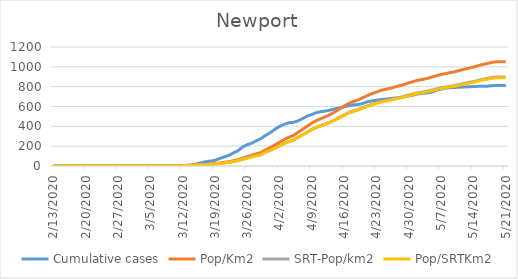
| Category | Cumulative cases | Pop/Km2 | SRT-Pop/km2 | Pop/SRTKm2 |
|---|---|---|---|---|
| 5/21/20 | 812 | 1051.296 | 897.581 | 889.834 |
| 5/20/20 | 812 | 1051.296 | 897.581 | 889.834 |
| 5/19/20 | 812 | 1051.049 | 897.37 | 889.625 |
| 5/18/20 | 810 | 1045.287 | 892.45 | 884.747 |
| 5/17/20 | 805 | 1033.022 | 881.978 | 874.366 |
| 5/16/20 | 805 | 1023.884 | 874.176 | 866.632 |
| 5/15/20 | 803 | 1011.042 | 863.212 | 855.762 |
| 5/14/20 | 801 | 996.801 | 851.053 | 843.708 |
| 5/13/20 | 799 | 986.923 | 842.619 | 835.347 |
| 5/12/20 | 796 | 975.563 | 832.92 | 825.732 |
| 5/11/20 | 795 | 964.285 | 823.292 | 816.186 |
| 5/10/20 | 792 | 950.291 | 811.344 | 804.341 |
| 5/9/20 | 790 | 942.141 | 804.386 | 797.443 |
| 5/8/20 | 785 | 931.934 | 795.671 | 788.803 |
| 5/7/20 | 775 | 923.702 | 788.642 | 781.836 |
| 5/6/20 | 764 | 910.119 | 777.046 | 770.339 |
| 5/5/20 | 745 | 896.537 | 765.449 | 758.843 |
| 5/4/20 | 738 | 883.448 | 754.274 | 747.764 |
| 5/3/20 | 732 | 872.911 | 745.278 | 738.846 |
| 5/2/20 | 727 | 865.173 | 738.671 | 732.296 |
| 5/1/20 | 715 | 851.426 | 726.934 | 720.66 |
| 4/30/20 | 707 | 838.419 | 715.829 | 709.651 |
| 4/29/20 | 696 | 822.614 | 702.335 | 696.274 |
| 4/28/20 | 688 | 809.196 | 690.879 | 684.916 |
| 4/27/20 | 685 | 797.178 | 680.618 | 674.744 |
| 4/26/20 | 680 | 783.677 | 669.091 | 663.317 |
| 4/25/20 | 674 | 773.881 | 660.728 | 655.025 |
| 4/24/20 | 670 | 762.768 | 651.24 | 645.619 |
| 4/23/20 | 663 | 745.728 | 636.691 | 631.196 |
| 4/22/20 | 657 | 729.429 | 622.775 | 617.4 |
| 4/21/20 | 647 | 708.767 | 605.134 | 599.911 |
| 4/20/20 | 630 | 687.94 | 587.353 | 582.283 |
| 4/19/20 | 620 | 665.302 | 568.025 | 563.122 |
| 4/18/20 | 616 | 650.65 | 555.515 | 550.72 |
| 4/17/20 | 607 | 630.646 | 538.436 | 533.789 |
| 4/16/20 | 597 | 604.139 | 515.805 | 511.353 |
| 4/15/20 | 586 | 574.587 | 490.573 | 486.339 |
| 4/14/20 | 577 | 545.364 | 465.623 | 461.604 |
| 4/13/20 | 564 | 519.845 | 443.835 | 440.005 |
| 4/12/20 | 555 | 497.866 | 425.07 | 421.401 |
| 4/11/20 | 548 | 477.862 | 407.991 | 404.47 |
| 4/10/20 | 538 | 457.776 | 390.842 | 387.469 |
| 4/9/20 | 520 | 433.08 | 369.757 | 366.566 |
| 4/8/20 | 503 | 400.976 | 342.347 | 339.392 |
| 4/7/20 | 478 | 369.448 | 315.429 | 312.706 |
| 4/6/20 | 455 | 338.496 | 289.003 | 286.508 |
| 4/5/20 | 440 | 307.297 | 262.365 | 260.101 |
| 4/4/20 | 436 | 289.104 | 246.833 | 244.703 |
| 4/3/20 | 420 | 265.973 | 227.083 | 225.124 |
| 4/2/20 | 398 | 239.301 | 204.312 | 202.548 |
| 4/1/20 | 370 | 211.889 | 180.908 | 179.346 |
| 3/31/20 | 336 | 185.547 | 158.417 | 157.05 |
| 3/30/20 | 309 | 163.239 | 139.371 | 138.168 |
| 3/29/20 | 277 | 135.744 | 115.896 | 114.896 |
| 3/28/20 | 255 | 122.902 | 104.932 | 104.026 |
| 3/27/20 | 230 | 109.237 | 93.265 | 92.46 |
| 3/26/20 | 215 | 94.008 | 80.263 | 79.57 |
| 3/25/20 | 191 | 79.685 | 68.034 | 67.446 |
| 3/24/20 | 154 | 64.62 | 55.172 | 54.696 |
| 3/23/20 | 132 | 53.507 | 45.684 | 45.289 |
| 3/22/20 | 106 | 42.806 | 36.547 | 36.232 |
| 3/21/20 | 91 | 36.55 | 31.206 | 30.936 |
| 3/20/20 | 75 | 30.376 | 25.934 | 25.71 |
| 3/19/20 | 57 | 24.449 | 20.874 | 20.694 |
| 3/18/20 | 49 | 19.51 | 16.657 | 16.513 |
| 3/17/20 | 43 | 16.628 | 14.197 | 14.075 |
| 3/16/20 | 32 | 13.583 | 11.597 | 11.497 |
| 3/15/20 | 21 | 10.784 | 9.207 | 9.128 |
| 3/14/20 | 9 | 8.397 | 7.169 | 7.107 |
| 3/13/20 | 5 | 6.832 | 5.833 | 5.783 |
| 3/12/20 | 1 | 4.61 | 3.936 | 3.902 |
| 3/11/20 | 1 | 2.634 | 2.249 | 2.23 |
| 3/10/20 | 0 | 1.482 | 1.265 | 1.254 |
| 3/9/20 | 0 | 0.576 | 0.492 | 0.488 |
| 3/8/20 | 0 | 0.329 | 0.281 | 0.279 |
| 3/7/20 | 0 | 0.329 | 0.281 | 0.279 |
| 3/6/20 | 0 | 0.165 | 0.141 | 0.139 |
| 3/5/20 | 0 | 0.165 | 0.141 | 0.139 |
| 3/4/20 | 0 | 0.165 | 0.141 | 0.139 |
| 3/3/20 | 0 | 0.082 | 0.07 | 0.07 |
| 3/2/20 | 0 | 0.082 | 0.07 | 0.07 |
| 3/1/20 | 0 | 0.082 | 0.07 | 0.07 |
| 2/29/20 | 0 | 0.082 | 0.07 | 0.07 |
| 2/28/20 | 0 | 0.082 | 0.07 | 0.07 |
| 2/27/20 | 0 | 0.082 | 0.07 | 0.07 |
| 2/26/20 | 0 | 0 | 0 | 0 |
| 2/25/20 | 0 | 0 | 0 | 0 |
| 2/24/20 | 0 | 0 | 0 | 0 |
| 2/23/20 | 0 | 0 | 0 | 0 |
| 2/22/20 | 0 | 0 | 0 | 0 |
| 2/21/20 | 0 | 0 | 0 | 0 |
| 2/20/20 | 0 | 0 | 0 | 0 |
| 2/19/20 | 0 | 0 | 0 | 0 |
| 2/18/20 | 0 | 0 | 0 | 0 |
| 2/17/20 | 0 | 0 | 0 | 0 |
| 2/16/20 | 0 | 0 | 0 | 0 |
| 2/15/20 | 0 | 0 | 0 | 0 |
| 2/14/20 | 0 | 0 | 0 | 0 |
| 2/13/20 | 0 | 0 | 0 | 0 |